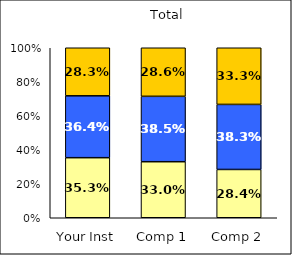
| Category | Low Civic Minded Practice | Average Civic Minded Practice | High Civic Minded Practice |
|---|---|---|---|
| Your Inst | 0.353 | 0.364 | 0.283 |
| Comp 1 | 0.33 | 0.385 | 0.286 |
| Comp 2 | 0.284 | 0.383 | 0.333 |